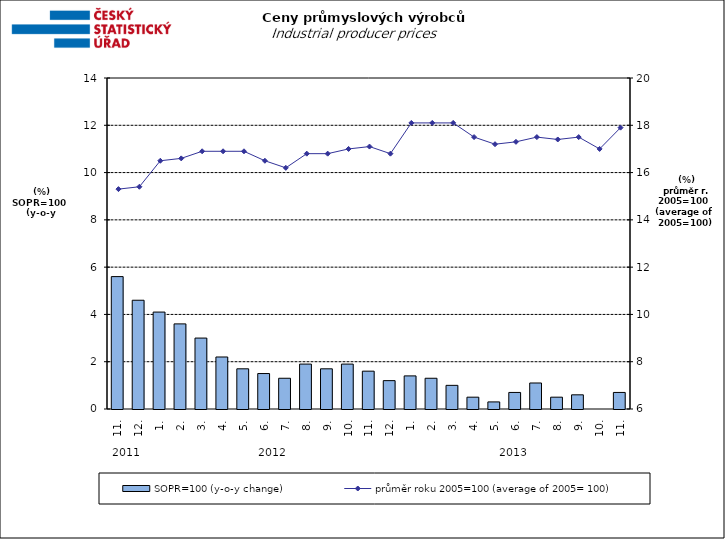
| Category | SOPR=100 (y-o-y change)   |
|---|---|
| 0 | 5.6 |
| 1 | 4.6 |
| 2 | 4.1 |
| 3 | 3.6 |
| 4 | 3 |
| 5 | 2.2 |
| 6 | 1.7 |
| 7 | 1.5 |
| 8 | 1.3 |
| 9 | 1.9 |
| 10 | 1.7 |
| 11 | 1.9 |
| 12 | 1.6 |
| 13 | 1.2 |
| 14 | 1.4 |
| 15 | 1.3 |
| 16 | 1 |
| 17 | 0.5 |
| 18 | 0.3 |
| 19 | 0.7 |
| 20 | 1.1 |
| 21 | 0.5 |
| 22 | 0.6 |
| 23 | 0 |
| 24 | 0.7 |